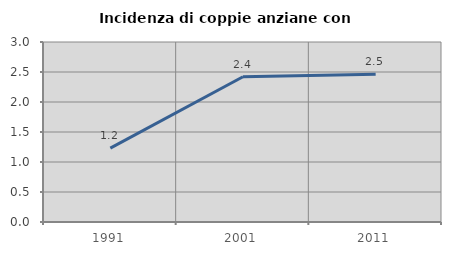
| Category | Incidenza di coppie anziane con figli |
|---|---|
| 1991.0 | 1.231 |
| 2001.0 | 2.42 |
| 2011.0 | 2.463 |